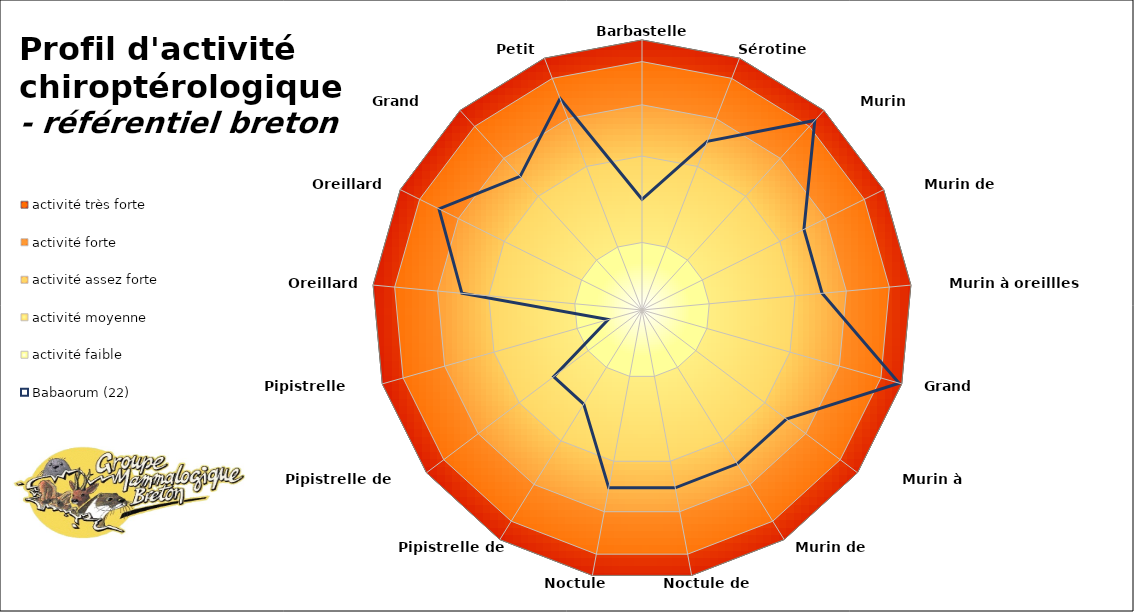
| Category | activité très forte | activité forte | activité assez forte | activité moyenne | activité faible | 0 | Babaorum (22) |
|---|---|---|---|---|---|---|---|
| Barbastelle d'Europe | 100 | 92 | 76 | 57 | 25 | 0 | 41 |
| Sérotine commune | 100 | 92 | 76 | 57 | 25 | 0 | 67 |
| Murin d'Alcathoe | 100 | 92 | 76 | 57 | 25 | 0 | 95 |
| Murin de Daubenton | 100 | 92 | 76 | 57 | 25 | 0 | 67 |
| Murin à oreillles échancrées | 100 | 92 | 76 | 57 | 25 | 0 | 67 |
| Grand Murin | 100 | 92 | 76 | 57 | 25 | 0 | 99 |
| Murin à moustaches | 100 | 92 | 76 | 57 | 25 | 0 | 67 |
| Murin de Natterer | 100 | 92 | 76 | 57 | 25 | 0 | 67 |
| Noctule de Leisler | 100 | 92 | 76 | 57 | 25 | 0 | 67 |
| Noctule commune | 100 | 92 | 76 | 57 | 25 | 0 | 67 |
| Pipistrelle de Kuhl | 100 | 92 | 76 | 57 | 25 | 0 | 41 |
| Pipistrelle de Nathusius | 100 | 92 | 76 | 57 | 25 | 0 | 41 |
| Pipistrelle commune | 100 | 92 | 76 | 57 | 25 | 0 | 13 |
| Oreillard gris | 100 | 92 | 76 | 57 | 25 | 0 | 67 |
| Oreillard roux | 100 | 92 | 76 | 57 | 25 | 0 | 84 |
| Grand Rhinolophe | 100 | 92 | 76 | 57 | 25 | 0 | 67 |
| Petit Rhinolophe | 100 | 92 | 76 | 57 | 25 | 0 | 84 |